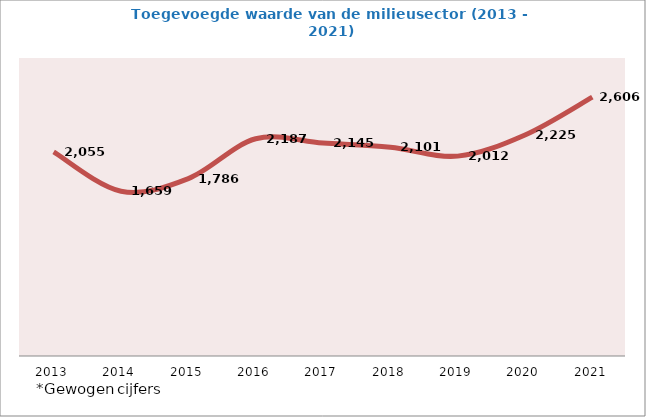
| Category | Series 0 |
|---|---|
| 2013.0 | 2054.694 |
| 2014.0 | 1659.168 |
| 2015.0 | 1785.788 |
| 2016.0 | 2187.007 |
| 2017.0 | 2144.687 |
| 2018.0 | 2101.277 |
| 2019.0 | 2012.173 |
| 2020.0 | 2225.162 |
| 2021.0 | 2606.309 |